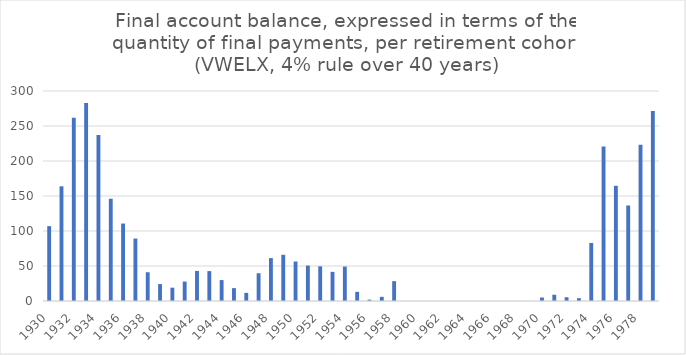
| Category | Series 0 |
|---|---|
| 1930.0 | 106.944 |
| 1931.0 | 163.84 |
| 1932.0 | 261.633 |
| 1933.0 | 282.694 |
| 1934.0 | 237.076 |
| 1935.0 | 146.078 |
| 1936.0 | 110.66 |
| 1937.0 | 89.228 |
| 1938.0 | 41.09 |
| 1939.0 | 24.185 |
| 1940.0 | 19.022 |
| 1941.0 | 27.809 |
| 1942.0 | 42.976 |
| 1943.0 | 42.724 |
| 1944.0 | 29.893 |
| 1945.0 | 18.403 |
| 1946.0 | 11.612 |
| 1947.0 | 39.645 |
| 1948.0 | 61.282 |
| 1949.0 | 66.015 |
| 1950.0 | 56.422 |
| 1951.0 | 50.587 |
| 1952.0 | 49.567 |
| 1953.0 | 41.66 |
| 1954.0 | 49.199 |
| 1955.0 | 13.055 |
| 1956.0 | 1.928 |
| 1957.0 | 5.93 |
| 1958.0 | 28.375 |
| 1959.0 | 0 |
| 1960.0 | 0 |
| 1961.0 | 0 |
| 1962.0 | 0 |
| 1963.0 | 0 |
| 1964.0 | 0 |
| 1965.0 | 0 |
| 1966.0 | 0 |
| 1967.0 | 0 |
| 1968.0 | 0 |
| 1969.0 | 0 |
| 1970.0 | 5.015 |
| 1971.0 | 8.96 |
| 1972.0 | 5.398 |
| 1973.0 | 4.039 |
| 1974.0 | 82.956 |
| 1975.0 | 220.814 |
| 1976.0 | 164.557 |
| 1977.0 | 136.475 |
| 1978.0 | 223.288 |
| 1979.0 | 271.412 |